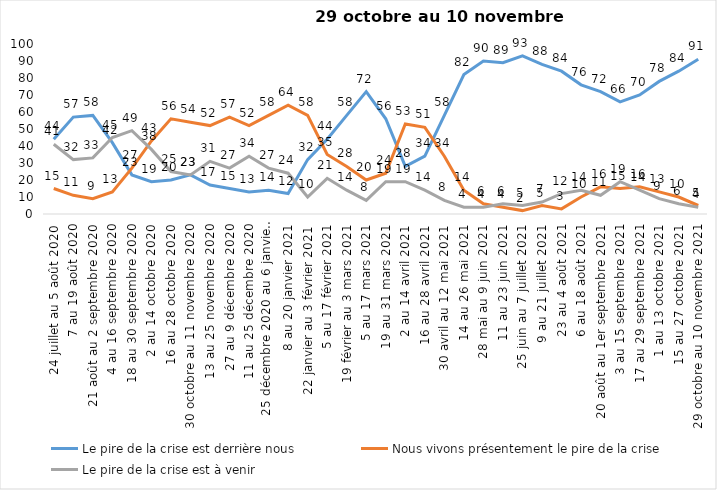
| Category | Le pire de la crise est derrière nous | Nous vivons présentement le pire de la crise | Le pire de la crise est à venir |
|---|---|---|---|
| 24 juillet au 5 août 2020 | 44 | 15 | 41 |
| 7 au 19 août 2020 | 57 | 11 | 32 |
| 21 août au 2 septembre 2020 | 58 | 9 | 33 |
| 4 au 16 septembre 2020 | 42 | 13 | 45 |
| 18 au 30 septembre 2020 | 23 | 27 | 49 |
| 2 au 14 octobre 2020 | 19 | 43 | 38 |
| 16 au 28 octobre 2020 | 20 | 56 | 25 |
| 30 octobre au 11 novembre 2020 | 23 | 54 | 23 |
| 13 au 25 novembre 2020 | 17 | 52 | 31 |
| 27 au 9 décembre 2020 | 15 | 57 | 27 |
| 11 au 25 décembre 2020 | 13 | 52 | 34 |
| 25 décembre 2020 au 6 janvier 2021 | 14 | 58 | 27 |
| 8 au 20 janvier 2021 | 12 | 64 | 24 |
| 22 janvier au 3 février 2021 | 32 | 58 | 10 |
| 5 au 17 février 2021 | 44 | 35 | 21 |
| 19 février au 3 mars 2021 | 58 | 28 | 14 |
| 5 au 17 mars 2021 | 72 | 20 | 8 |
| 19 au 31 mars 2021 | 56 | 24 | 19 |
| 2 au 14 avril 2021 | 28 | 53 | 19 |
| 16 au 28 avril 2021 | 34 | 51 | 14 |
| 30 avril au 12 mai 2021 | 58 | 34 | 8 |
| 14 au 26 mai 2021 | 82 | 14 | 4 |
| 28 mai au 9 juin 2021 | 90 | 6 | 4 |
| 11 au 23 juin 2021 | 89 | 4 | 6 |
| 25 juin au 7 juillet 2021 | 93 | 2 | 5 |
| 9 au 21 juillet 2021 | 88 | 5 | 7 |
| 23 au 4 août 2021 | 84 | 3 | 12 |
| 6 au 18 août 2021 | 76 | 10 | 14 |
| 20 août au 1er septembre 2021 | 72 | 16 | 11 |
| 3 au 15 septembre 2021 | 66 | 15 | 19 |
| 17 au 29 septembre 2021 | 70 | 16 | 14 |
| 1 au 13 octobre 2021 | 78 | 13 | 9 |
| 15 au 27 octobre 2021 | 84 | 10 | 6 |
| 29 octobre au 10 novembre 2021 | 91 | 5 | 4 |